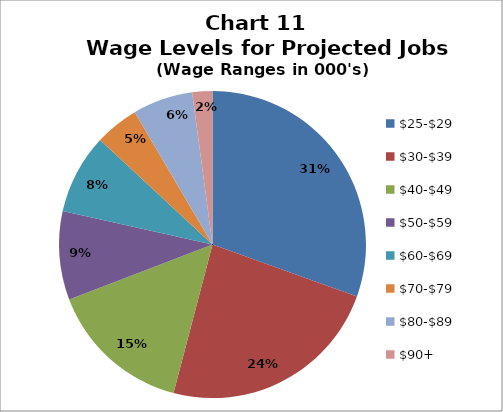
| Category | Series 1 |
|---|---|
| $25-$29 | 0.305 |
| $30-$39 | 0.236 |
| $40-$49 | 0.151 |
| $50-$59 | 0.093 |
| $60-$69 | 0.084 |
| $70-$79 | 0.046 |
| $80-$89 | 0.063 |
| $90+ | 0.021 |